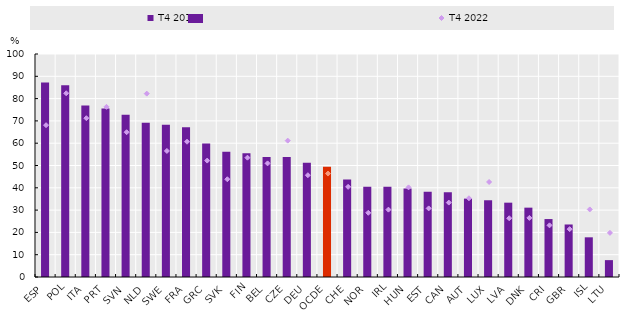
| Category | T4 2019 |
|---|---|
| ESP | 87.225 |
| POL | 86.021 |
| ITA | 76.884 |
| PRT | 75.603 |
| SVN | 72.753 |
| NLD | 69.201 |
| SWE | 68.259 |
| FRA | 67.128 |
| GRC | 59.822 |
| SVK | 56.206 |
| FIN | 55.498 |
| BEL | 53.803 |
| CZE | 53.779 |
| DEU | 51.216 |
| OCDE | 49.39 |
| CHE | 43.736 |
| NOR | 40.523 |
| IRL | 40.426 |
| HUN | 39.701 |
| EST | 38.248 |
| CAN | 38.007 |
| AUT | 35.152 |
| LUX | 34.414 |
| LVA | 33.331 |
| DNK | 31.097 |
| CRI | 25.98 |
| GBR | 23.551 |
| ISL | 17.796 |
| LTU | 7.566 |